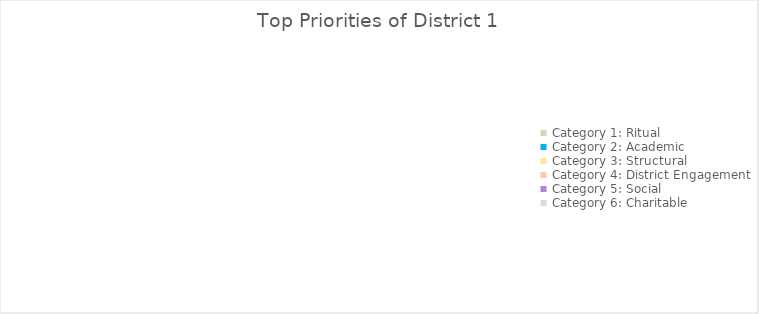
| Category | Top Priority |
|---|---|
| Category 1: Ritual | 0 |
| Category 2: Academic | 0 |
| Category 3: Structural | 0 |
| Category 4: District Engagement | 0 |
| Category 5: Social | 0 |
| Category 6: Charitable | 0 |